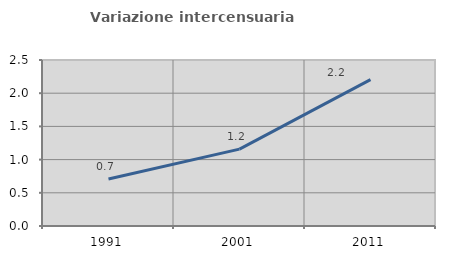
| Category | Variazione intercensuaria annua |
|---|---|
| 1991.0 | 0.707 |
| 2001.0 | 1.158 |
| 2011.0 | 2.204 |